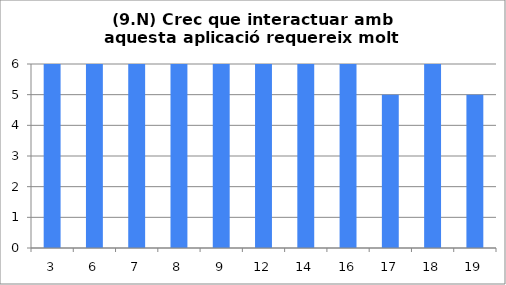
| Category | 9 |
|---|---|
| 3.0 | 6 |
| 6.0 | 6 |
| 7.0 | 6 |
| 8.0 | 6 |
| 9.0 | 6 |
| 12.0 | 6 |
| 14.0 | 6 |
| 16.0 | 6 |
| 17.0 | 5 |
| 18.0 | 6 |
| 19.0 | 5 |